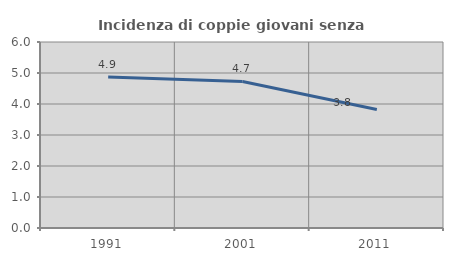
| Category | Incidenza di coppie giovani senza figli |
|---|---|
| 1991.0 | 4.867 |
| 2001.0 | 4.727 |
| 2011.0 | 3.824 |